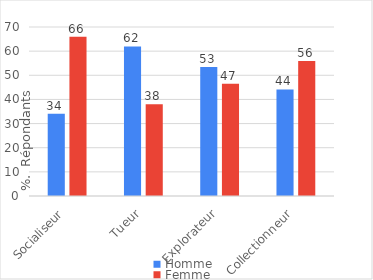
| Category | Homme | Femme |
|---|---|---|
| Socialiseur | 34.016 | 65.984 |
| Tueur | 61.947 | 38.053 |
| Explorateur | 53.456 | 46.544 |
| Collectionneur | 44.127 | 55.873 |